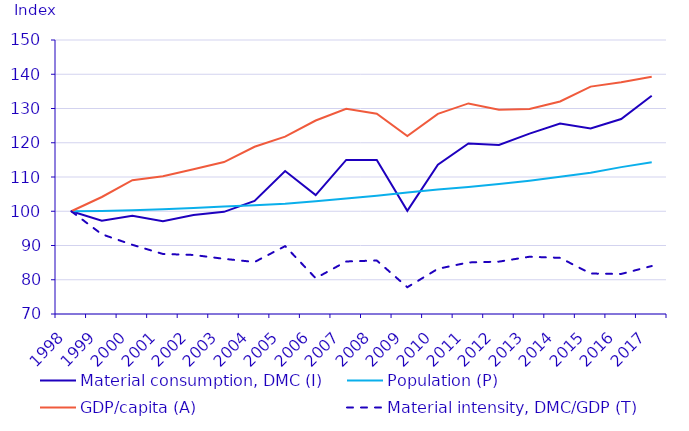
| Category | Material consumption, DMC (I) | Population (P) | GDP/capita (A) | Material intensity, DMC/GDP (T) |
|---|---|---|---|---|
| 1998.0 | 100 | 100 | 100 | 100 |
| 1999.0 | 97.241 | 100.08 | 104.165 | 93.278 |
| 2000.0 | 98.687 | 100.322 | 109.058 | 90.201 |
| 2001.0 | 97.091 | 100.619 | 110.243 | 87.528 |
| 2002.0 | 98.892 | 100.977 | 112.257 | 87.242 |
| 2003.0 | 99.823 | 101.37 | 114.366 | 86.104 |
| 2004.0 | 103.025 | 101.774 | 118.833 | 85.186 |
| 2005.0 | 111.764 | 102.185 | 121.771 | 89.82 |
| 2006.0 | 104.732 | 102.924 | 126.498 | 80.441 |
| 2007.0 | 114.99 | 103.711 | 129.928 | 85.336 |
| 2008.0 | 114.985 | 104.54 | 128.462 | 85.622 |
| 2009.0 | 100.134 | 105.493 | 121.98 | 77.817 |
| 2010.0 | 113.618 | 106.339 | 128.43 | 83.194 |
| 2011.0 | 119.768 | 107.099 | 131.486 | 85.051 |
| 2012.0 | 119.331 | 107.923 | 129.637 | 85.292 |
| 2013.0 | 122.65 | 108.928 | 129.834 | 86.723 |
| 2014.0 | 125.596 | 110.086 | 132.053 | 86.396 |
| 2015.0 | 124.146 | 111.257 | 136.392 | 81.812 |
| 2016.0 | 126.936 | 112.884 | 137.651 | 81.69 |
| 2017.0 | 133.722 | 114.297 | 139.269 | 84.007 |